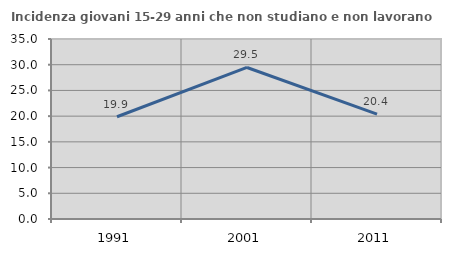
| Category | Incidenza giovani 15-29 anni che non studiano e non lavorano  |
|---|---|
| 1991.0 | 19.881 |
| 2001.0 | 29.465 |
| 2011.0 | 20.396 |